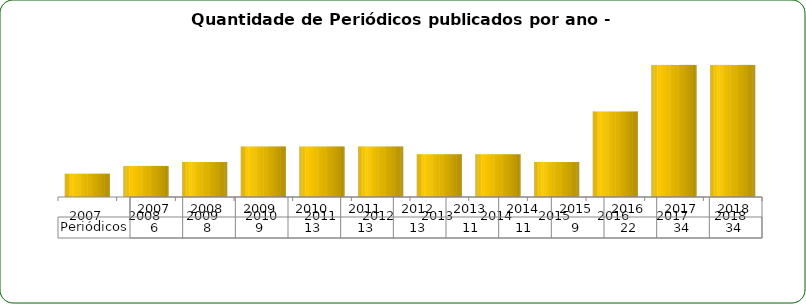
| Category | Periódicos |
|---|---|
| 2007.0 | 6 |
| 2008.0 | 8 |
| 2009.0 | 9 |
| 2010.0 | 13 |
| 2011.0 | 13 |
| 2012.0 | 13 |
| 2013.0 | 11 |
| 2014.0 | 11 |
| 2015.0 | 9 |
| 2016.0 | 22 |
| 2017.0 | 34 |
| 2018.0 | 34 |